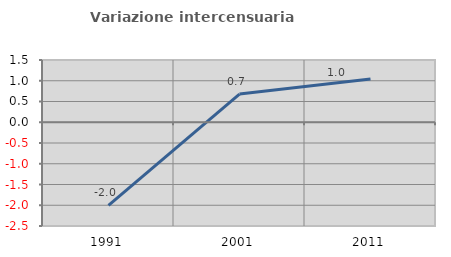
| Category | Variazione intercensuaria annua |
|---|---|
| 1991.0 | -2.003 |
| 2001.0 | 0.68 |
| 2011.0 | 1.042 |